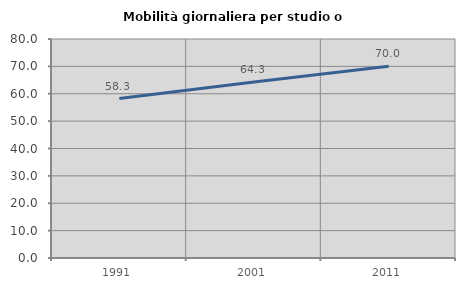
| Category | Mobilità giornaliera per studio o lavoro |
|---|---|
| 1991.0 | 58.264 |
| 2001.0 | 64.325 |
| 2011.0 | 70.05 |